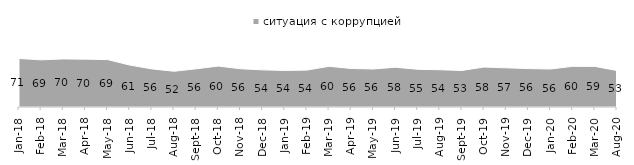
| Category | ситуация с коррупцией |
|---|---|
| 2018-01-01 | 70.95 |
| 2018-02-01 | 69 |
| 2018-03-01 | 70.4 |
| 2018-04-01 | 70 |
| 2018-05-01 | 69.35 |
| 2018-06-01 | 61.35 |
| 2018-07-01 | 55.75 |
| 2018-08-01 | 52.3 |
| 2018-09-01 | 55.85 |
| 2018-10-01 | 59.9 |
| 2018-11-01 | 55.938 |
| 2018-12-01 | 54.35 |
| 2019-01-01 | 53.5 |
| 2019-02-01 | 54 |
| 2019-03-01 | 59.523 |
| 2019-04-01 | 56.386 |
| 2019-05-01 | 55.622 |
| 2019-06-01 | 58.204 |
| 2019-07-01 | 55.149 |
| 2019-08-01 | 54.496 |
| 2019-09-01 | 53.465 |
| 2019-10-01 | 58.465 |
| 2019-11-01 | 57.327 |
| 2019-12-01 | 56.238 |
| 2020-01-01 | 55.594 |
| 2020-02-01 | 59.505 |
| 2020-03-01 | 59.445 |
| 2020-08-01 | 53.327 |